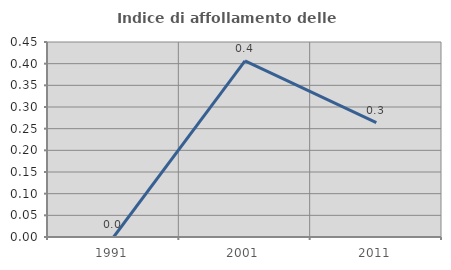
| Category | Indice di affollamento delle abitazioni  |
|---|---|
| 1991.0 | 0 |
| 2001.0 | 0.407 |
| 2011.0 | 0.264 |